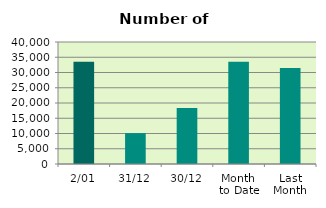
| Category | Series 0 |
|---|---|
| 2/01 | 33516 |
| 31/12 | 10114 |
| 30/12 | 18330 |
| Month 
to Date | 33516 |
| Last
Month | 31497.9 |